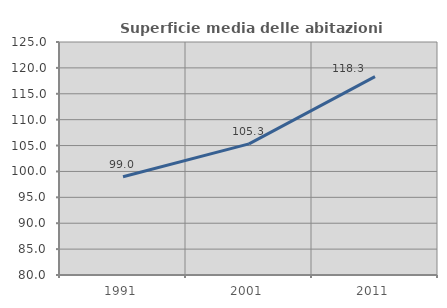
| Category | Superficie media delle abitazioni occupate |
|---|---|
| 1991.0 | 98.963 |
| 2001.0 | 105.316 |
| 2011.0 | 118.325 |